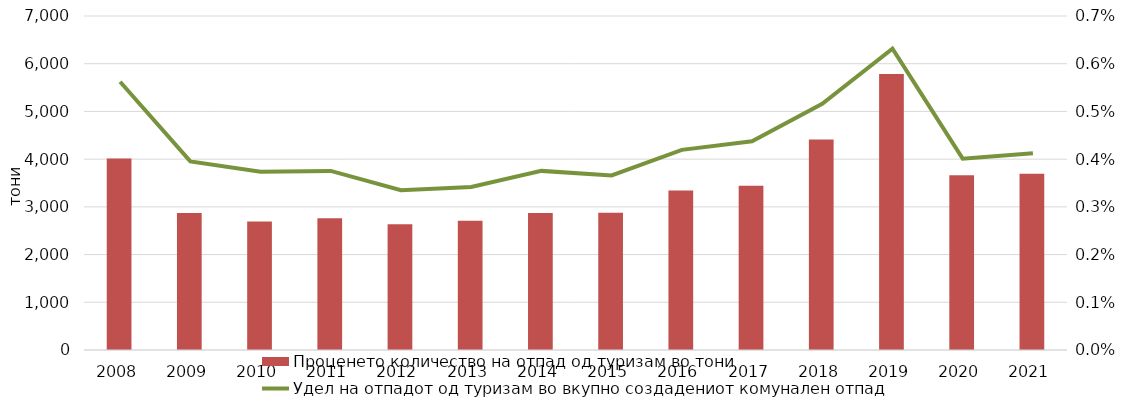
| Category | Проценето количество на отпад од туризам во тони |
|---|---|
| 2008 | 4012.361 |
| 2009 | 2869.598 |
| 2010 | 2694.041 |
| 2011 | 2759.57 |
| 2012 | 2636.55 |
| 2013 | 2709.366 |
| 2014 | 2872.35 |
| 2015 | 2875.313 |
| 2016 | 3341.304 |
| 2017 | 3442.767 |
| 2018 | 4410.735 |
| 2019 | 5785.438 |
| 2020 | 3660.929 |
| 2021 | 3695.47 |